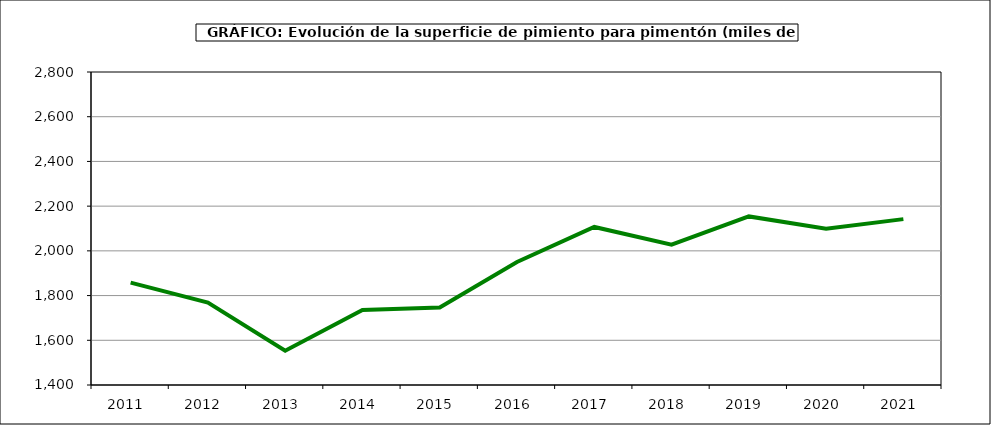
| Category | Superficie |
|---|---|
| 2011.0 | 1858 |
| 2012.0 | 1769 |
| 2013.0 | 1553 |
| 2014.0 | 1736 |
| 2015.0 | 1747 |
| 2016.0 | 1950 |
| 2017.0 | 2107 |
| 2018.0 | 2028 |
| 2019.0 | 2154 |
| 2020.0 | 2099 |
| 2021.0 | 2142 |